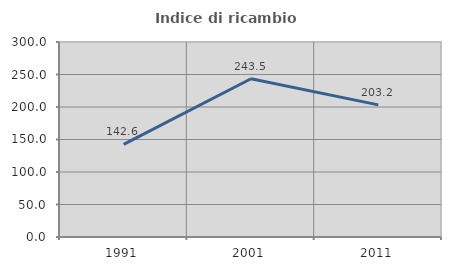
| Category | Indice di ricambio occupazionale  |
|---|---|
| 1991.0 | 142.574 |
| 2001.0 | 243.478 |
| 2011.0 | 203.226 |